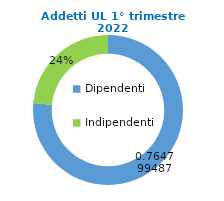
| Category | Series 0 |
|---|---|
| Dipendenti | 71612 |
| Indipendenti | 22023 |